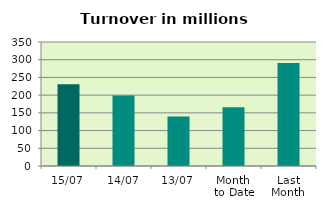
| Category | Series 0 |
|---|---|
| 15/07 | 230.554 |
| 14/07 | 198.648 |
| 13/07 | 139.485 |
| Month 
to Date | 165.952 |
| Last
Month | 290.981 |